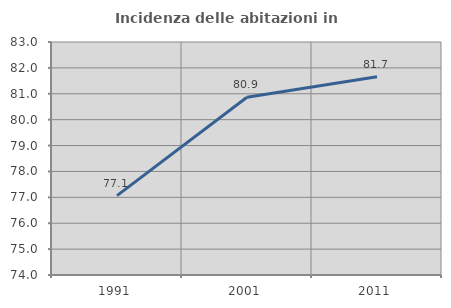
| Category | Incidenza delle abitazioni in proprietà  |
|---|---|
| 1991.0 | 77.068 |
| 2001.0 | 80.866 |
| 2011.0 | 81.655 |